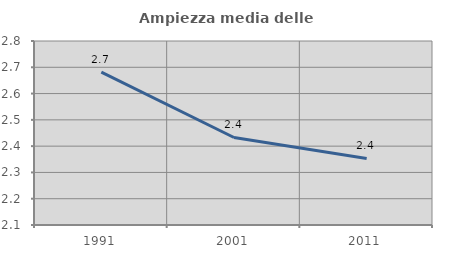
| Category | Ampiezza media delle famiglie |
|---|---|
| 1991.0 | 2.681 |
| 2001.0 | 2.433 |
| 2011.0 | 2.353 |